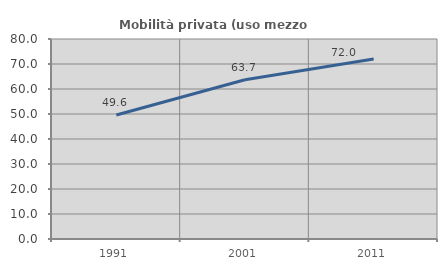
| Category | Mobilità privata (uso mezzo privato) |
|---|---|
| 1991.0 | 49.628 |
| 2001.0 | 63.682 |
| 2011.0 | 72 |